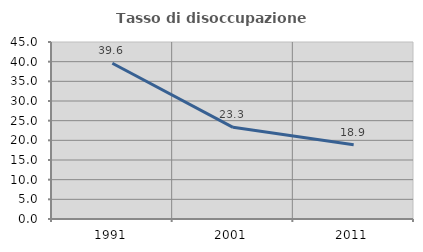
| Category | Tasso di disoccupazione giovanile  |
|---|---|
| 1991.0 | 39.604 |
| 2001.0 | 23.301 |
| 2011.0 | 18.889 |